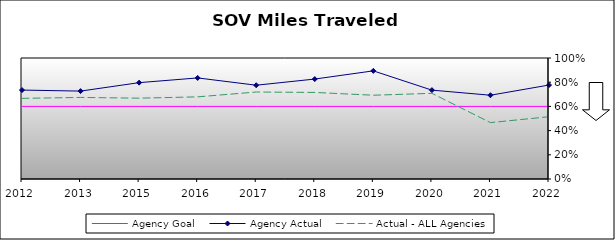
| Category | Agency Goal | Agency Actual | Actual - ALL Agencies |
|---|---|---|---|
| 2012.0 | 0.6 | 0.735 | 0.666 |
| 2013.0 | 0.6 | 0.726 | 0.674 |
| 2015.0 | 0.6 | 0.796 | 0.668 |
| 2016.0 | 0.6 | 0.835 | 0.679 |
| 2017.0 | 0.6 | 0.775 | 0.719 |
| 2018.0 | 0.6 | 0.826 | 0.715 |
| 2019.0 | 0.6 | 0.894 | 0.692 |
| 2020.0 | 0.6 | 0.734 | 0.708 |
| 2021.0 | 0.6 | 0.692 | 0.466 |
| 2022.0 | 0.6 | 0.776 | 0.515 |